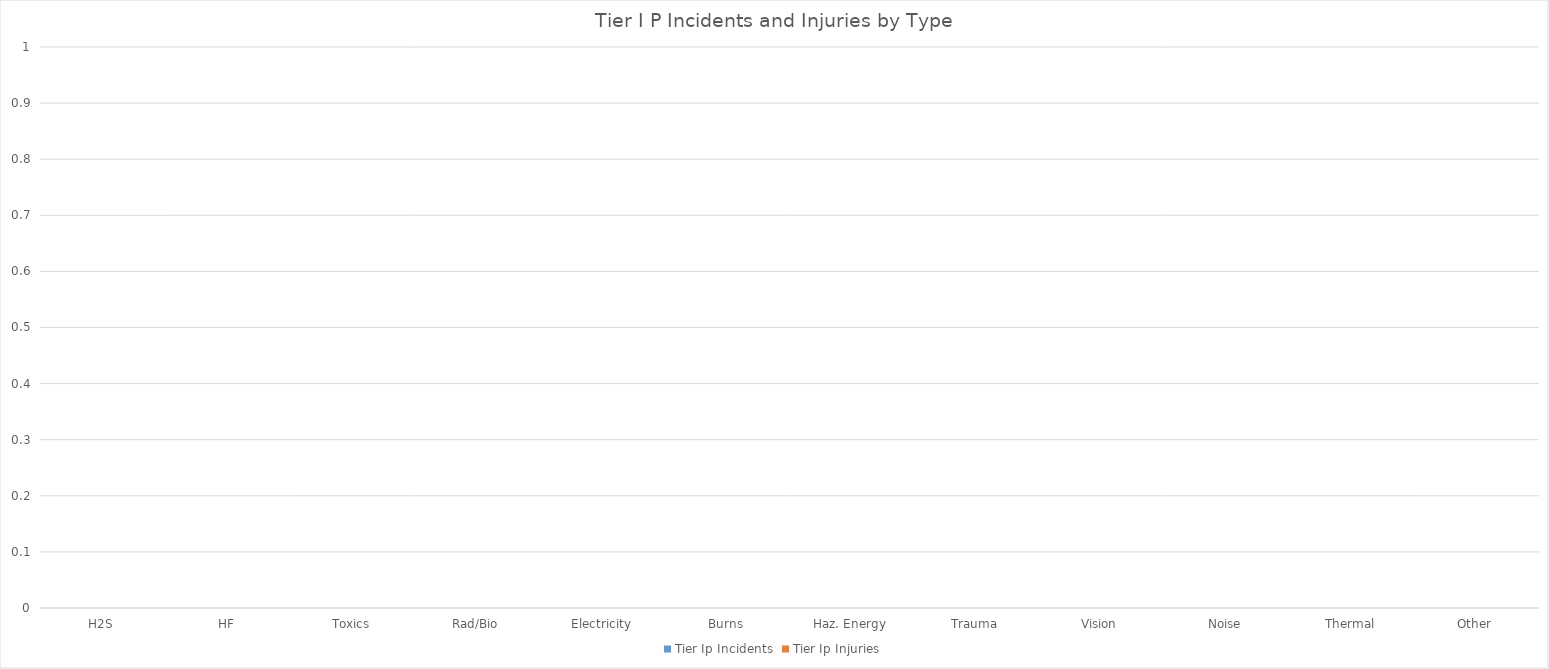
| Category | Tier Ip |
|---|---|
| H2S | 0 |
| HF | 0 |
| Toxics | 0 |
| Rad/Bio | 0 |
| Electricity | 0 |
| Burns | 0 |
| Haz. Energy | 0 |
| Trauma | 0 |
| Vision | 0 |
| Noise | 0 |
| Thermal | 0 |
| Other | 0 |